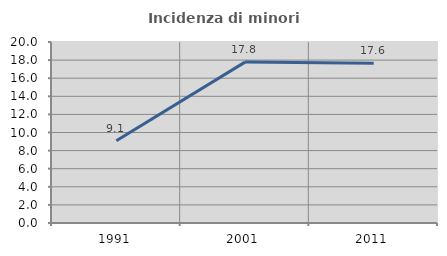
| Category | Incidenza di minori stranieri |
|---|---|
| 1991.0 | 9.091 |
| 2001.0 | 17.778 |
| 2011.0 | 17.647 |